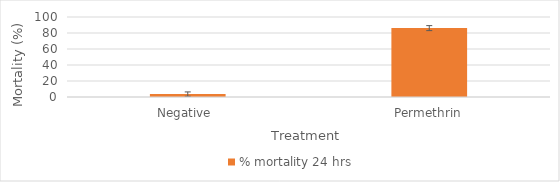
| Category | % mortality 24 hrs |
|---|---|
| Negative  | 3.636 |
| Permethrin | 86.111 |